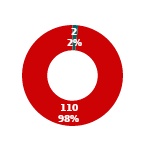
| Category | Series 10 |
|---|---|
| Count Complete | 2 |
| Count Not Complete | 110 |